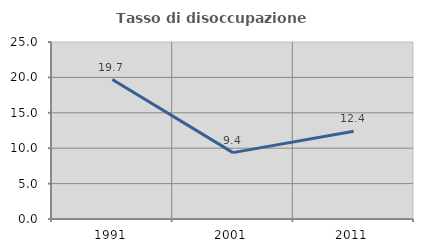
| Category | Tasso di disoccupazione giovanile  |
|---|---|
| 1991.0 | 19.697 |
| 2001.0 | 9.375 |
| 2011.0 | 12.403 |